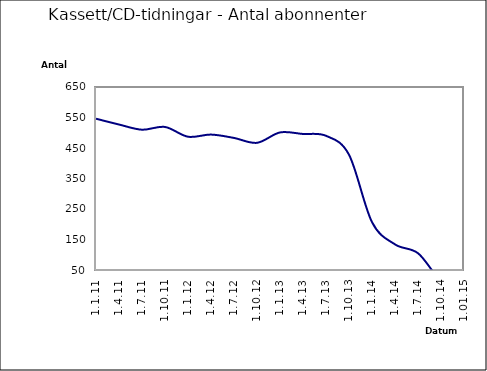
| Category | Series 0 |
|---|---|
| 1.1.11 | 546 |
| 1.4.11 | 527 |
| 1.7.11 | 510 |
| 1.10.11 | 519 |
| 1.1.12 | 487 |
| 1.4.12 | 494 |
| 1.7.12 | 483 |
| 1.10.12 | 467 |
| 1.1.13 | 501 |
| 1.4.13 | 496 |
| 1.7.13 | 490 |
| 1.10.13 | 428 |
| 1.1.14 | 207 |
| 1.4.14 | 134 |
| 1.7.14 | 105 |
| 1.10.14 | 17 |
| 1.01.15 | 0 |